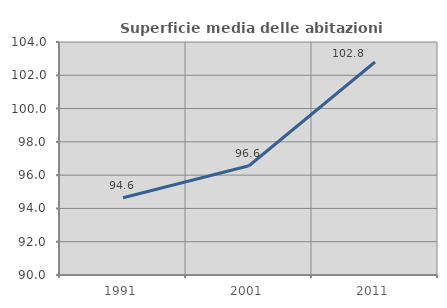
| Category | Superficie media delle abitazioni occupate |
|---|---|
| 1991.0 | 94.642 |
| 2001.0 | 96.565 |
| 2011.0 | 102.798 |